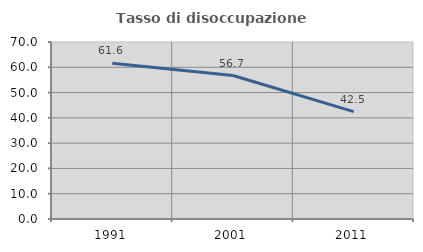
| Category | Tasso di disoccupazione giovanile  |
|---|---|
| 1991.0 | 61.633 |
| 2001.0 | 56.727 |
| 2011.0 | 42.453 |